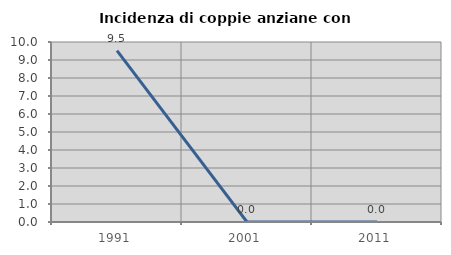
| Category | Incidenza di coppie anziane con figli |
|---|---|
| 1991.0 | 9.524 |
| 2001.0 | 0 |
| 2011.0 | 0 |